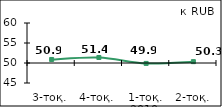
| Category | Диффузионный индекс* |
|---|---|
| 3-тоқ. | 50.88 |
| 4-тоқ. | 51.375 |
| 1-тоқ. 2010  | 49.895 |
| 2-тоқ. күту | 50.34 |